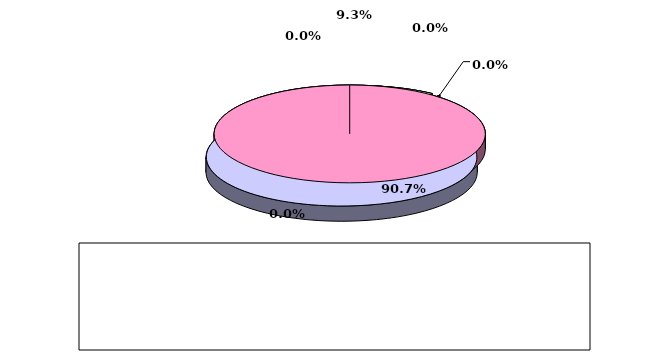
| Category | Series 0 |
|---|---|
| מזומנים ושווי מזומנים | 0.093 |
| אג"ח ממשלתיות סחירות | 0 |
| אג"ח קונצרני סחיר | 0 |
| ני"ע אחרים סחירים | 0.907 |
| פקדונות והלוואות | 0 |
| השקעות אחרות | 0 |